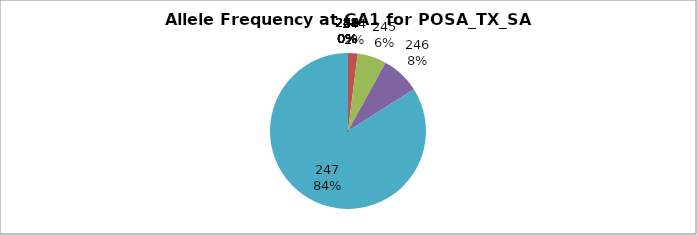
| Category | Series 0 |
|---|---|
| 221.0 | 0 |
| 238.0 | 0 |
| 239.0 | 0 |
| 240.0 | 0 |
| 241.0 | 0 |
| 242.0 | 0 |
| 243.0 | 0 |
| 244.0 | 0.02 |
| 245.0 | 0.06 |
| 246.0 | 0.08 |
| 247.0 | 0.84 |
| 248.0 | 0 |
| 249.0 | 0 |
| 250.0 | 0 |
| 251.0 | 0 |
| 253.0 | 0 |